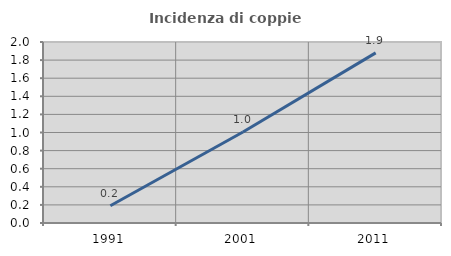
| Category | Incidenza di coppie miste |
|---|---|
| 1991.0 | 0.191 |
| 2001.0 | 1.005 |
| 2011.0 | 1.879 |